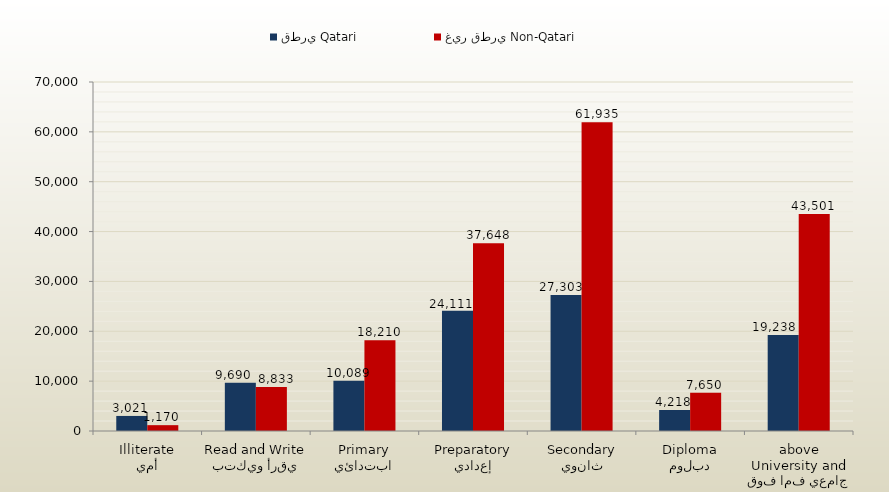
| Category | قطري Qatari | غير قطري Non-Qatari |
|---|---|---|
| أمي
Illiterate | 3021 | 1170 |
| يقرأ ويكتب
Read and Write | 9690 | 8833 |
| ابتدائي
Primary | 10089 | 18210 |
| إعدادي
Preparatory | 24111 | 37648 |
| ثانوي
Secondary | 27303 | 61935 |
| دبلوم
Diploma | 4218 | 7650 |
| جامعي فما فوق
University and above | 19238 | 43501 |